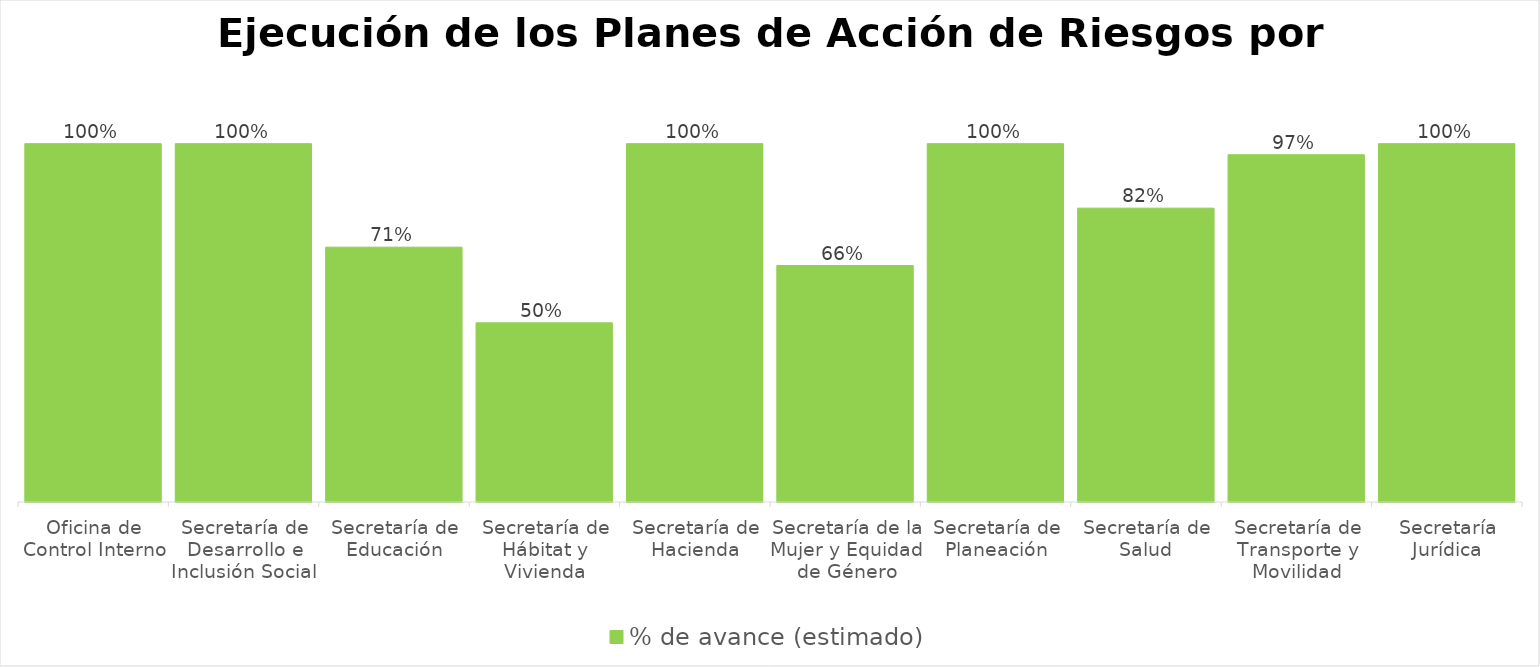
| Category | % de avance (estimado) |
|---|---|
| Oficina de Control Interno | 1 |
| Secretaría de Desarrollo e Inclusión Social | 1 |
| Secretaría de Educación | 0.711 |
| Secretaría de Hábitat y Vivienda | 0.5 |
| Secretaría de Hacienda | 1 |
| Secretaría de la Mujer y Equidad de Género | 0.66 |
| Secretaría de Planeación | 1 |
| Secretaría de Salud | 0.82 |
| Secretaría de Transporte y Movilidad | 0.969 |
| Secretaría Jurídica | 1 |